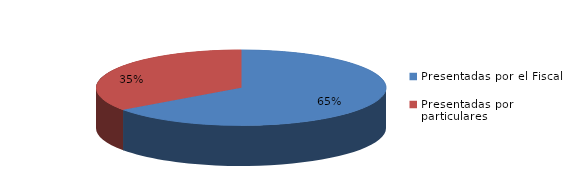
| Category | Series 0 |
|---|---|
| Presentadas por el Fiscal | 274 |
| Presentadas por particulares | 147 |